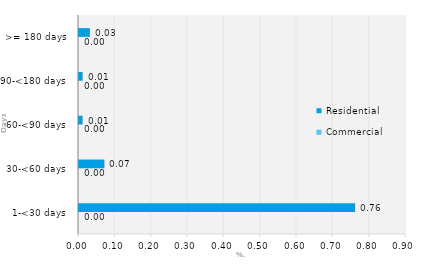
| Category | Commercial | Residential |
|---|---|---|
| 1-<30 days | 0 | 0.76 |
| 30-<60 days | 0 | 0.07 |
| 60-<90 days | 0 | 0.01 |
| 90-<180 days | 0 | 0.01 |
| >= 180 days | 0 | 0.03 |